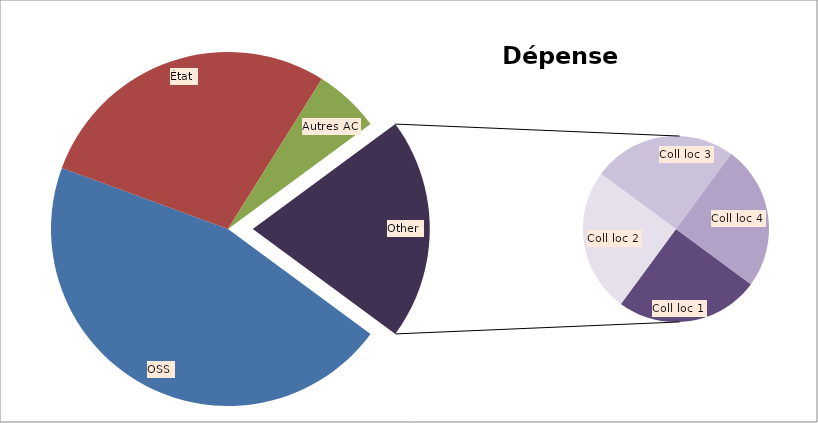
| Category | Dépenses |
|---|---|
| OSS | 450.5 |
| État | 280.2 |
| Autres AC | 59.4 |
| Coll loc 1 | 50 |
| Coll loc 2 | 50 |
| Coll loc 3 | 50 |
| Coll loc 4 | 50 |